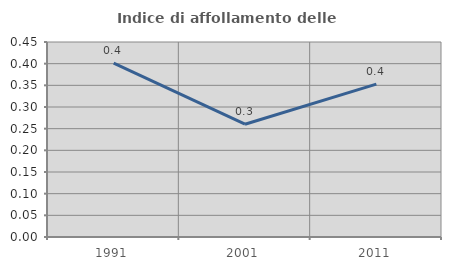
| Category | Indice di affollamento delle abitazioni  |
|---|---|
| 1991.0 | 0.401 |
| 2001.0 | 0.26 |
| 2011.0 | 0.353 |